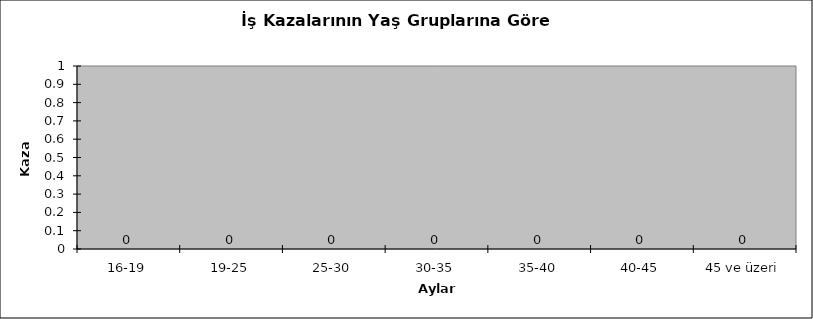
| Category | Series 1 |
|---|---|
| 16-19 | 0 |
| 19-25 | 0 |
| 25-30 | 0 |
| 30-35 | 0 |
| 35-40 | 0 |
| 40-45 | 0 |
| 45 ve üzeri | 0 |